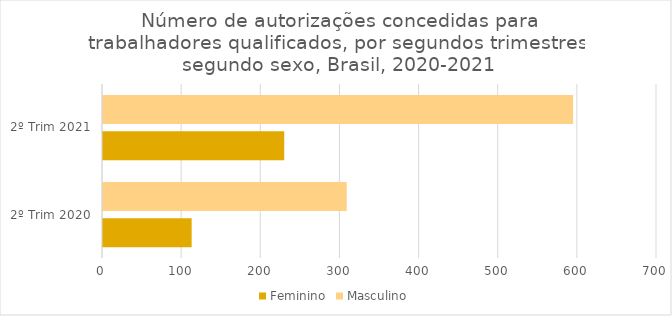
| Category | Feminino | Masculino |
|---|---|---|
| 2º Trim 2020 | 112 | 308 |
| 2º Trim 2021 | 229 | 594 |